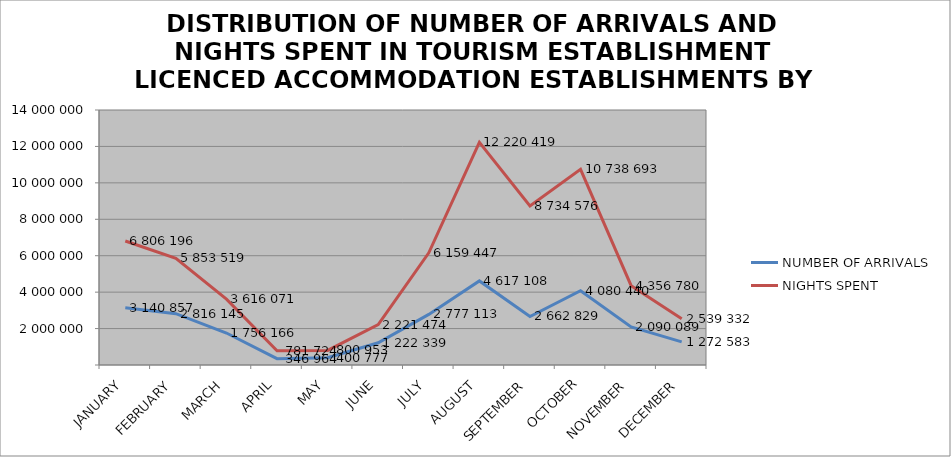
| Category | NUMBER OF ARRIVALS | NIGHTS SPENT |
|---|---|---|
| JANUARY | 3140857 | 6806196 |
| FEBRUARY | 2816145 | 5853519 |
| MARCH | 1756166 | 3616071 |
| APRIL | 346964 | 781724 |
| MAY | 400777 | 800953 |
| JUNE | 1222339 | 2221474 |
| JULY | 2777113 | 6159447 |
| AUGUST | 4617108 | 12220419 |
| SEPTEMBER | 2662829 | 8734576 |
| OCTOBER | 4080440 | 10738693 |
| NOVEMBER | 2090089 | 4356780 |
| DECEMBER | 1272583 | 2539332 |